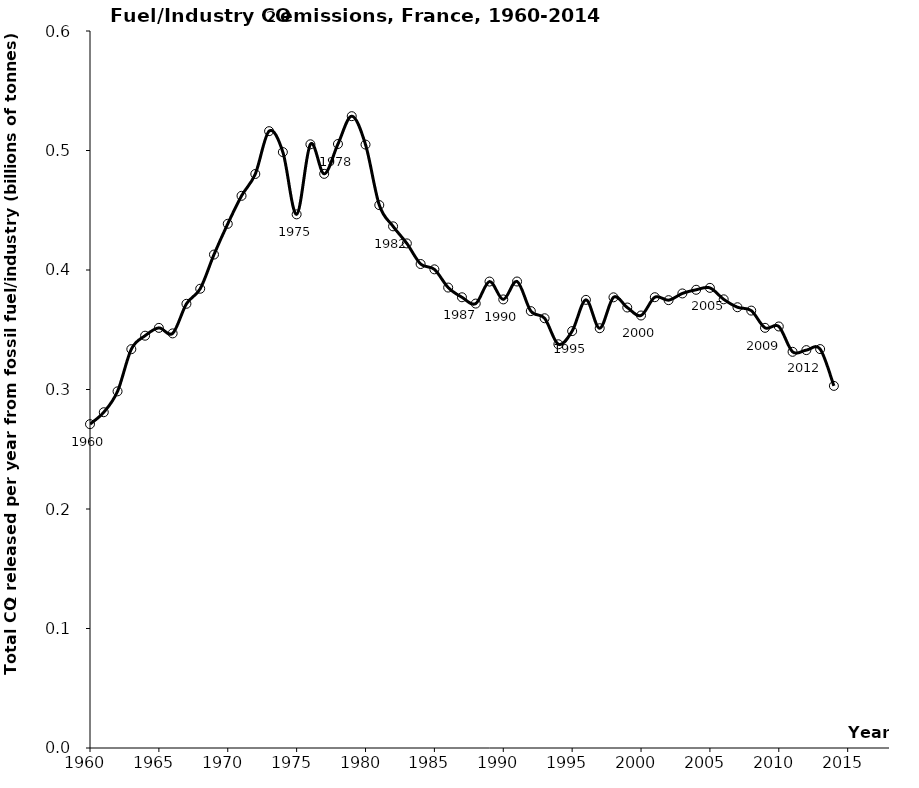
| Category | Series 0 |
|---|---|
| 1960.0 | 0.271 |
| 1961.0 | 0.281 |
| 1962.0 | 0.298 |
| 1963.0 | 0.334 |
| 1964.0 | 0.345 |
| 1965.0 | 0.352 |
| 1966.0 | 0.347 |
| 1967.0 | 0.372 |
| 1968.0 | 0.384 |
| 1969.0 | 0.413 |
| 1970.0 | 0.439 |
| 1971.0 | 0.462 |
| 1972.0 | 0.48 |
| 1973.0 | 0.516 |
| 1974.0 | 0.499 |
| 1975.0 | 0.447 |
| 1976.0 | 0.505 |
| 1977.0 | 0.48 |
| 1978.0 | 0.505 |
| 1979.0 | 0.529 |
| 1980.0 | 0.505 |
| 1981.0 | 0.454 |
| 1982.0 | 0.437 |
| 1983.0 | 0.422 |
| 1984.0 | 0.405 |
| 1985.0 | 0.401 |
| 1986.0 | 0.385 |
| 1987.0 | 0.377 |
| 1988.0 | 0.372 |
| 1989.0 | 0.39 |
| 1990.0 | 0.375 |
| 1991.0 | 0.39 |
| 1992.0 | 0.366 |
| 1993.0 | 0.36 |
| 1994.0 | 0.338 |
| 1995.0 | 0.349 |
| 1996.0 | 0.375 |
| 1997.0 | 0.351 |
| 1998.0 | 0.377 |
| 1999.0 | 0.369 |
| 2000.0 | 0.362 |
| 2001.0 | 0.377 |
| 2002.0 | 0.375 |
| 2003.0 | 0.38 |
| 2004.0 | 0.383 |
| 2005.0 | 0.385 |
| 2006.0 | 0.375 |
| 2007.0 | 0.369 |
| 2008.0 | 0.366 |
| 2009.0 | 0.352 |
| 2010.0 | 0.353 |
| 2011.0 | 0.332 |
| 2012.0 | 0.333 |
| 2013.0 | 0.334 |
| 2014.0 | 0.303 |